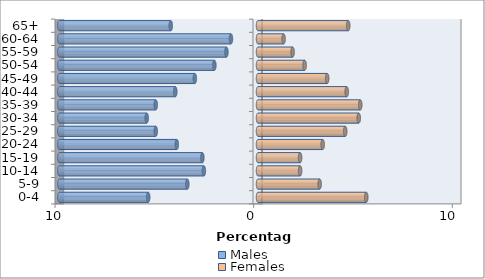
| Category | Males | Females |
|---|---|---|
| 0-4 | -5.526 | 5.45 |
| 5-9 | -3.558 | 3.104 |
| 10-14 | -2.725 | 2.12 |
| 15-19 | -2.801 | 2.12 |
| 20-24 | -4.088 | 3.255 |
| 25-29 | -5.148 | 4.391 |
| 30-34 | -5.602 | 5.072 |
| 35-39 | -5.148 | 5.148 |
| 40-44 | -4.164 | 4.466 |
| 45-49 | -3.179 | 3.482 |
| 50-54 | -2.195 | 2.347 |
| 55-59 | -1.59 | 1.741 |
| 60-64 | -1.363 | 1.287 |
| 65+ | -4.391 | 4.542 |